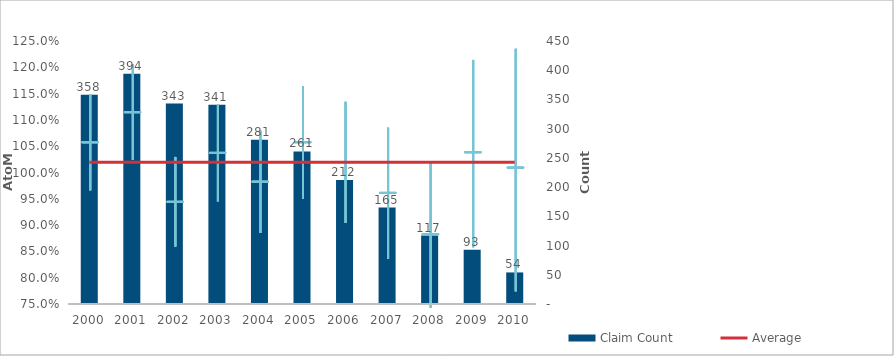
| Category | Claim Count |
|---|---|
| 0 | 358 |
| 1 | 394 |
| 2 | 343 |
| 3 | 341 |
| 4 | 281 |
| 5 | 261 |
| 6 | 212 |
| 7 | 165 |
| 8 | 117 |
| 9 | 93 |
| 10 | 54 |